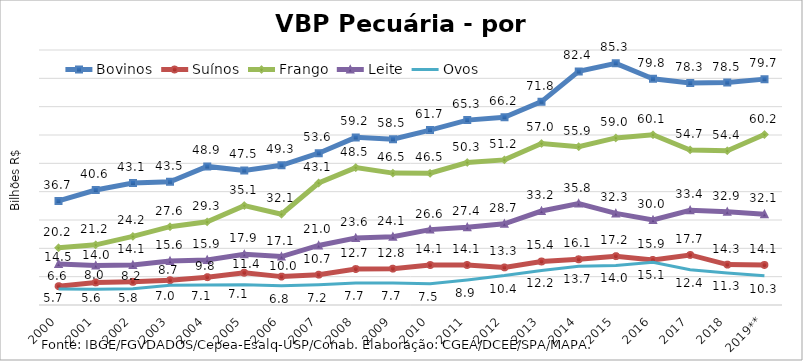
| Category | Bovinos | Suínos | Frango | Leite | Ovos |
|---|---|---|---|---|---|
| 2000 | 36.721 | 6.649 | 20.206 | 14.504 | 5.671 |
| 2001 | 40.591 | 7.977 | 21.238 | 13.957 | 5.588 |
| 2002 | 43.075 | 8.176 | 24.242 | 14.133 | 5.758 |
| 2003 | 43.474 | 8.738 | 27.638 | 15.563 | 6.965 |
| 2004 | 48.913 | 9.824 | 29.348 | 15.906 | 7.059 |
| 2005 | 47.488 | 11.39 | 35.088 | 17.89 | 7.107 |
| 2006 | 49.304 | 10.019 | 32.054 | 17.088 | 6.751 |
| 2007 | 53.582 | 10.713 | 43.068 | 21.007 | 7.174 |
| 2008 | 59.161 | 12.686 | 48.48 | 23.632 | 7.748 |
| 2009 | 58.544 | 12.823 | 46.548 | 24.093 | 7.726 |
| 2010 | 61.723 | 14.107 | 46.492 | 26.608 | 7.514 |
| 2011 | 65.251 | 14.129 | 50.283 | 27.429 | 8.854 |
| 2012 | 66.224 | 13.266 | 51.222 | 28.663 | 10.379 |
| 2013 | 71.763 | 15.361 | 57.01 | 33.168 | 12.207 |
| 2014 | 82.442 | 16.133 | 55.857 | 35.817 | 13.715 |
| 2015 | 85.28 | 17.242 | 58.968 | 32.331 | 13.965 |
| 2016 | 79.826 | 15.912 | 60.084 | 30 | 15.055 |
| 2017 | 78.335 | 17.663 | 54.726 | 33.426 | 12.409 |
| 2018 | 78.517 | 14.256 | 54.428 | 32.919 | 11.253 |
| 2019** | 79.718 | 14.122 | 60.151 | 32.058 | 10.33 |